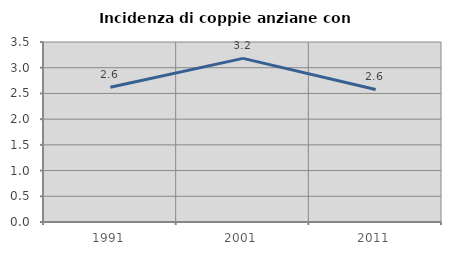
| Category | Incidenza di coppie anziane con figli |
|---|---|
| 1991.0 | 2.62 |
| 2001.0 | 3.182 |
| 2011.0 | 2.577 |